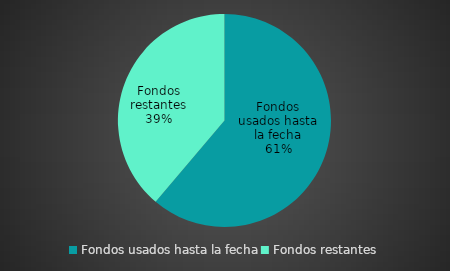
| Category | Importe |
|---|---|
| Fondos usados hasta la fecha | 122374 |
| Fondos restantes | 77626 |